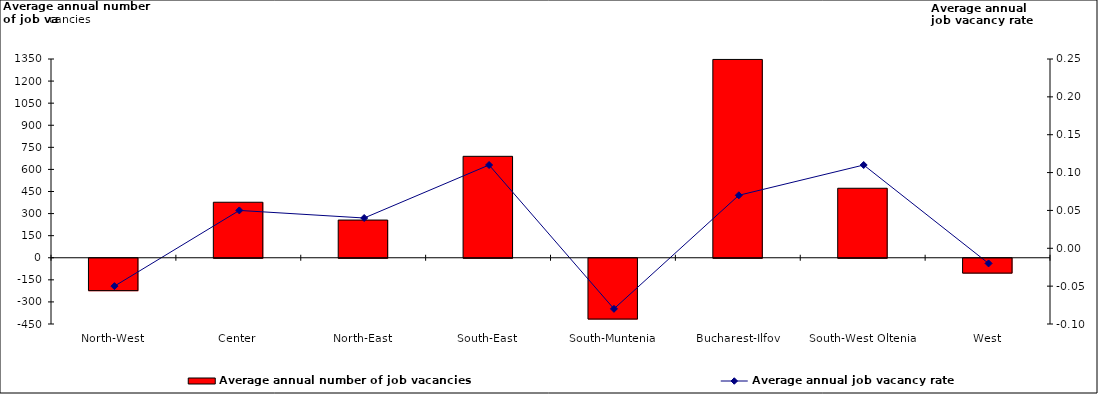
| Category | Average annual number of job vacancies |
|---|---|
| North-West | -220 |
| Center | 377 |
| North-East | 256 |
| South-East | 689 |
| South-Muntenia | -413 |
| Bucharest-Ilfov | 1347 |
| South-West Oltenia | 472 |
| West | -101 |